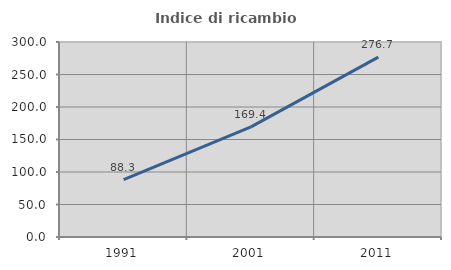
| Category | Indice di ricambio occupazionale  |
|---|---|
| 1991.0 | 88.333 |
| 2001.0 | 169.444 |
| 2011.0 | 276.667 |